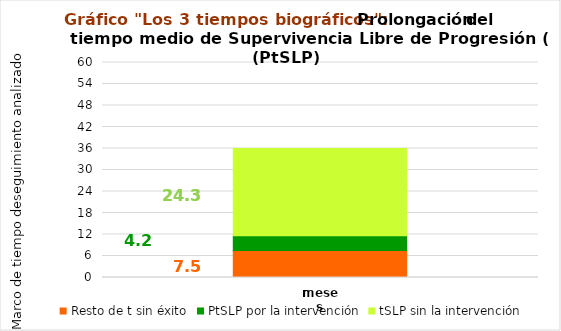
| Category | Resto de t sin éxito | PtSLP por la intervención | tSLP sin la intervención |
|---|---|---|---|
| meses | 7.519 | 4.167 | 24.315 |